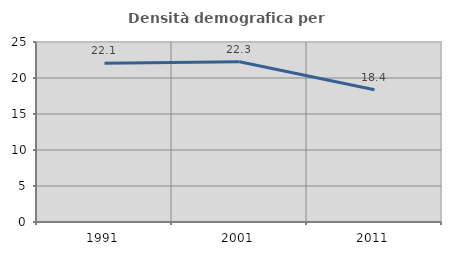
| Category | Densità demografica |
|---|---|
| 1991.0 | 22.054 |
| 2001.0 | 22.25 |
| 2011.0 | 18.362 |